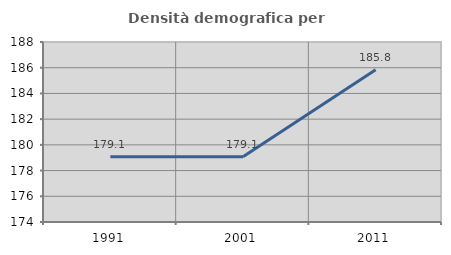
| Category | Densità demografica |
|---|---|
| 1991.0 | 179.071 |
| 2001.0 | 179.071 |
| 2011.0 | 185.848 |